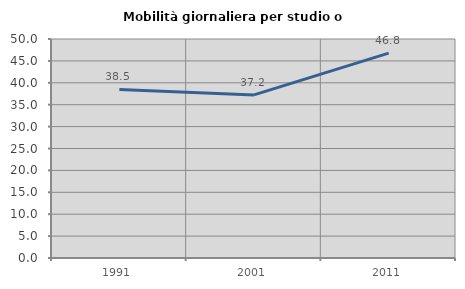
| Category | Mobilità giornaliera per studio o lavoro |
|---|---|
| 1991.0 | 38.489 |
| 2001.0 | 37.242 |
| 2011.0 | 46.784 |